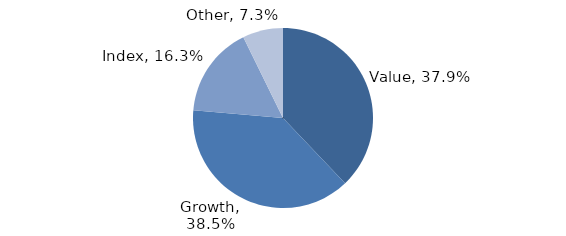
| Category | Investment Style |
|---|---|
| Value | 0.379 |
| Growth | 0.385 |
| Index | 0.163 |
| Other | 0.073 |